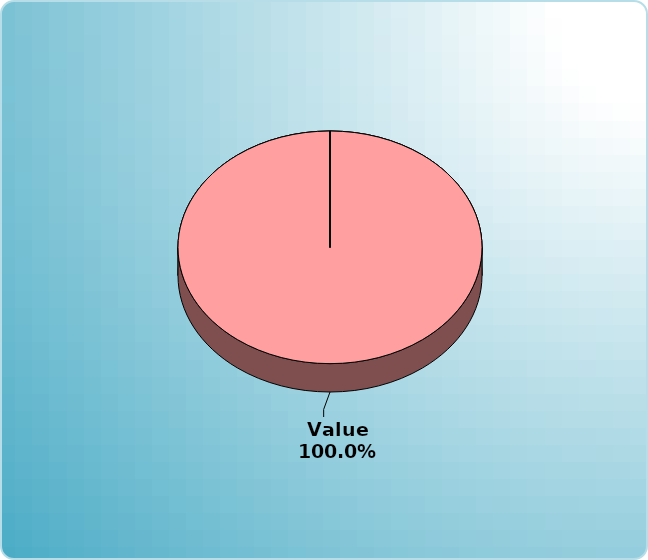
| Category | Series 0 |
|---|---|
| Cash | 0 |
| Bonds | 0 |
| Muni Bond | 0 |
| Hybrid bond | 0 |
| Value | 25000 |
| Growth | 0 |
| Small-Cap | 0 |
| Tangibles | 0 |
| International | 0 |
| Personal Property | 0 |
| Miscellaneous | 0 |